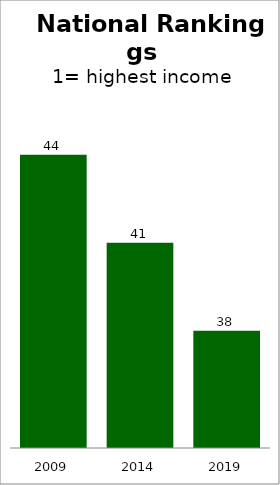
| Category | Series 0 |
|---|---|
| 2009.0 | 44 |
| 2014.0 | 41 |
| 2019.0 | 38 |